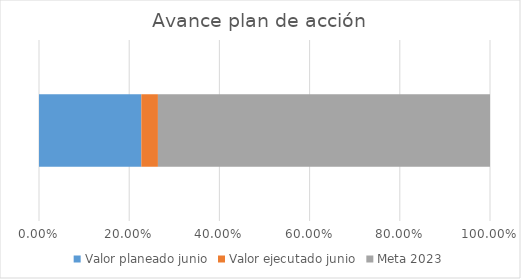
| Category | Valor planeado junio | Valor ejecutado junio | Meta 2023 |
|---|---|---|---|
| 0 | 0.227 | 0.037 | 0.736 |